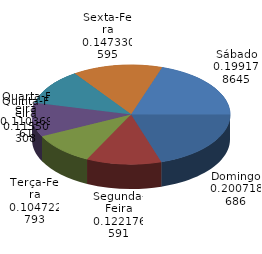
| Category | Qtde Acidentes |
|---|---|
| Domingo | 391 |
| Segunda-Feira | 238 |
| Terça-Feira | 204 |
| Quarta-Feira | 215 |
| Quinta-Feira | 225 |
| Sexta-Feira | 287 |
| Sábado | 388 |